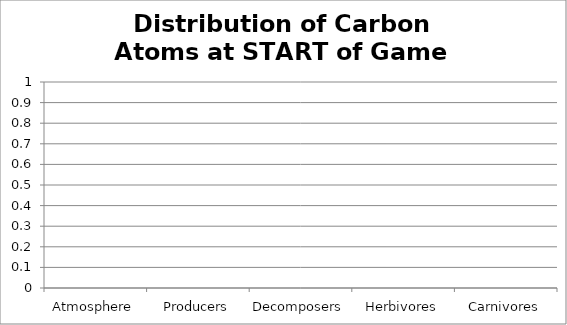
| Category | Series 0 |
|---|---|
| Atmosphere | 0 |
| Producers | 0 |
| Decomposers | 0 |
| Herbivores | 0 |
| Carnivores | 0 |